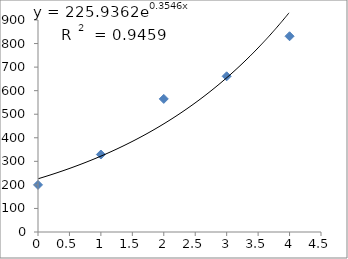
| Category | Series 0 |
|---|---|
| 0.0 | 200 |
| 1.0 | 329 |
| 2.0 | 565 |
| 3.0 | 661 |
| 4.0 | 831 |